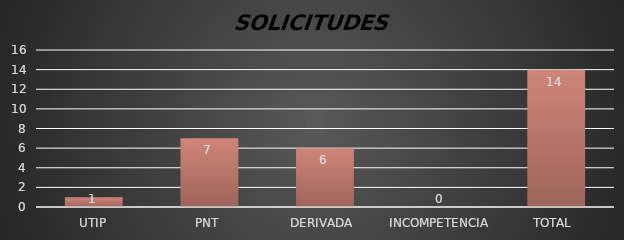
| Category | Series 1 |
|---|---|
| UTIP | 1 |
| PNT | 7 |
| DERIVADA  | 6 |
| INCOMPETENCIA | 0 |
| TOTAL  | 14 |